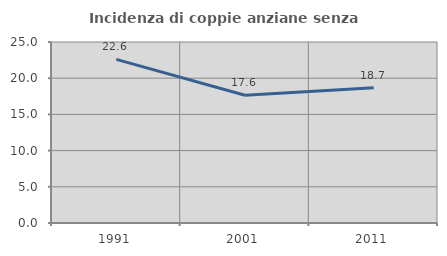
| Category | Incidenza di coppie anziane senza figli  |
|---|---|
| 1991.0 | 22.603 |
| 2001.0 | 17.647 |
| 2011.0 | 18.681 |